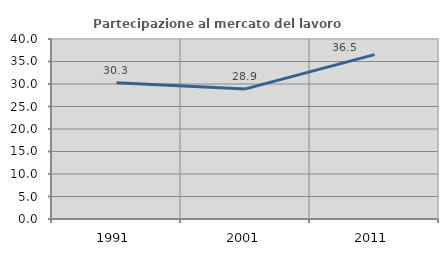
| Category | Partecipazione al mercato del lavoro  femminile |
|---|---|
| 1991.0 | 30.303 |
| 2001.0 | 28.907 |
| 2011.0 | 36.52 |